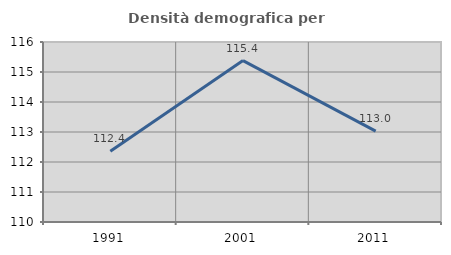
| Category | Densità demografica |
|---|---|
| 1991.0 | 112.36 |
| 2001.0 | 115.38 |
| 2011.0 | 113.031 |